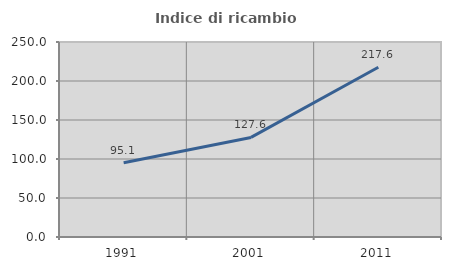
| Category | Indice di ricambio occupazionale  |
|---|---|
| 1991.0 | 95.125 |
| 2001.0 | 127.649 |
| 2011.0 | 217.563 |